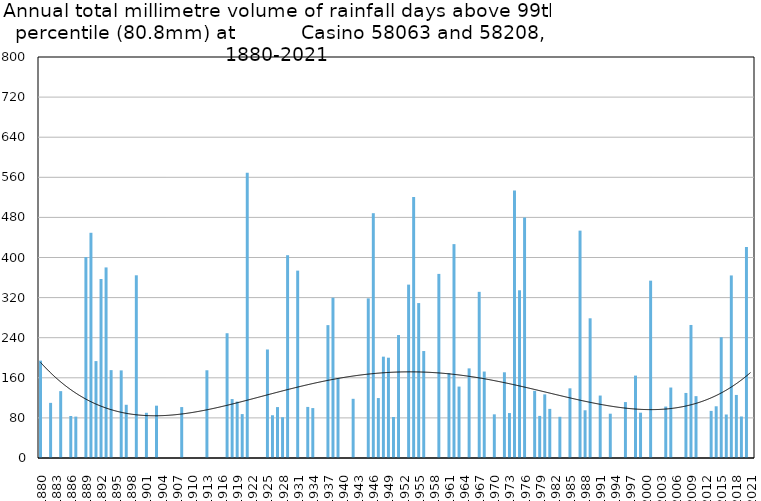
| Category | Annual total mm in days above 99th percentile |
|---|---|
| 1880 | 194.3 |
| 1881 | 0 |
| 1882 | 110 |
| 1883 | 0 |
| 1884 | 133.4 |
| 1885 | 0 |
| 1886 | 83.8 |
| 1887 | 82.6 |
| 1888 | 0 |
| 1889 | 400.9 |
| 1890 | 449.3 |
| 1891 | 193.3 |
| 1892 | 357.1 |
| 1893 | 380.2 |
| 1894 | 175.3 |
| 1895 | 0 |
| 1896 | 174.8 |
| 1897 | 106.2 |
| 1898 | 0 |
| 1899 | 364.5 |
| 1900 | 0 |
| 1901 | 90.2 |
| 1902 | 0 |
| 1903 | 104.4 |
| 1904 | 0 |
| 1905 | 0 |
| 1906 | 0 |
| 1907 | 0 |
| 1908 | 101.6 |
| 1909 | 0 |
| 1910 | 0 |
| 1911 | 0 |
| 1912 | 0 |
| 1913 | 175 |
| 1914 | 0 |
| 1915 | 0 |
| 1916 | 0 |
| 1917 | 248.9 |
| 1918 | 117.6 |
| 1919 | 112.5 |
| 1920 | 87.6 |
| 1921 | 569.2 |
| 1922 | 0 |
| 1923 | 0 |
| 1924 | 0 |
| 1925 | 216.5 |
| 1926 | 85.3 |
| 1927 | 101.6 |
| 1928 | 81.3 |
| 1929 | 404.6 |
| 1930 | 0 |
| 1931 | 373.8 |
| 1932 | 0 |
| 1933 | 101.9 |
| 1934 | 99.6 |
| 1935 | 0 |
| 1936 | 0 |
| 1937 | 265.1 |
| 1938 | 319.8 |
| 1939 | 159.5 |
| 1940 | 0 |
| 1941 | 0 |
| 1942 | 118.1 |
| 1943 | 0 |
| 1944 | 0 |
| 1945 | 318.5 |
| 1946 | 488.4 |
| 1947 | 119.6 |
| 1948 | 202.2 |
| 1949 | 200.1 |
| 1950 | 81.8 |
| 1951 | 245.3 |
| 1952 | 0 |
| 1953 | 345.9 |
| 1954 | 520.7 |
| 1955 | 309.1 |
| 1956 | 213.4 |
| 1957 | 0 |
| 1958 | 0 |
| 1959 | 367.3 |
| 1960 | 0 |
| 1961 | 169.2 |
| 1962 | 426.7 |
| 1963 | 142.5 |
| 1964 | 0 |
| 1965 | 178.8 |
| 1966 | 0 |
| 1967 | 331.5 |
| 1968 | 172.5 |
| 1969 | 0 |
| 1970 | 87.1 |
| 1971 | 0 |
| 1972 | 171 |
| 1973 | 89.7 |
| 1974 | 533.6 |
| 1975 | 334.6 |
| 1976 | 479.8 |
| 1977 | 0 |
| 1978 | 134 |
| 1979 | 84 |
| 1980 | 127 |
| 1981 | 98 |
| 1982 | 0 |
| 1983 | 82.2 |
| 1984 | 0 |
| 1985 | 139 |
| 1986 | 0 |
| 1987 | 453.6 |
| 1988 | 95.2 |
| 1989 | 278.7 |
| 1990 | 0 |
| 1991 | 124.6 |
| 1992 | 0 |
| 1993 | 88.4 |
| 1994 | 0 |
| 1995 | 0 |
| 1996 | 111.6 |
| 1997 | 0 |
| 1998 | 164.4 |
| 1999 | 90.4 |
| 2000 | 0 |
| 2001 | 353.8 |
| 2002 | 0 |
| 2003 | 0 |
| 2004 | 102.6 |
| 2005 | 140.6 |
| 2006 | 0 |
| 2007 | 0 |
| 2008 | 129.8 |
| 2009 | 265.4 |
| 2010 | 123.4 |
| 2011 | 0 |
| 2012 | 0 |
| 2013 | 94 |
| 2014 | 103.2 |
| 2015 | 241 |
| 2016 | 86.8 |
| 2017 | 364.2 |
| 2018 | 125.8 |
| 2019 | 82.8 |
| 2020 | 421 |
| 2021 | 0 |